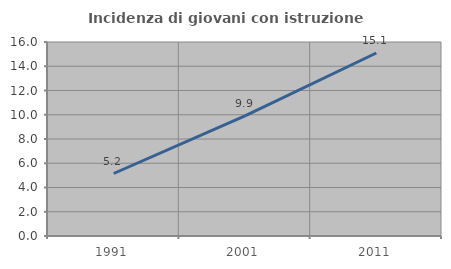
| Category | Incidenza di giovani con istruzione universitaria |
|---|---|
| 1991.0 | 5.155 |
| 2001.0 | 9.91 |
| 2011.0 | 15.094 |